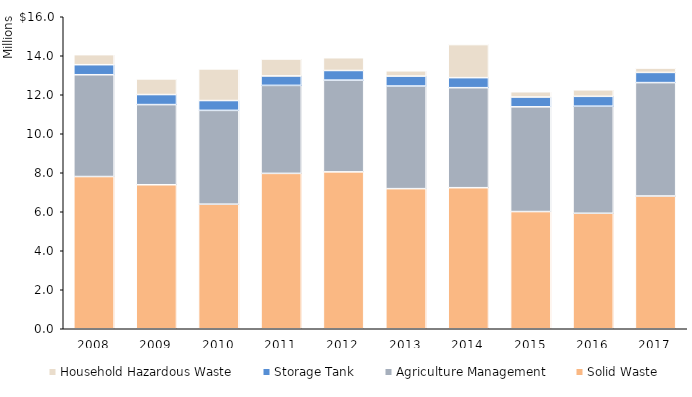
| Category | Solid Waste | Agriculture Management | Storage Tank | Household Hazardous Waste |
|---|---|---|---|---|
| 2008.0 | 7806570 | 5220148 | 514437 | 514819 |
| 2009.0 | 7385240 | 4110622 | 515181 | 801067 |
| 2010.0 | 6388345 | 4811060 | 504327 | 1621209 |
| 2011.0 | 7968735 | 4511238 | 485791 | 865802 |
| 2012.0 | 8045169 | 4705044 | 494322 | 653790 |
| 2013.0 | 7185062 | 5262229 | 508858 | 271406 |
| 2014.0 | 7233747 | 5128759 | 514424 | 1695495 |
| 2015.0 | 6010392.37 | 5371108 | 502725 | 271197 |
| 2016.0 | 5922924 | 5490501 | 505685 | 332888 |
| 2017.0 | 6806900 | 5816042 | 522403 | 222124 |